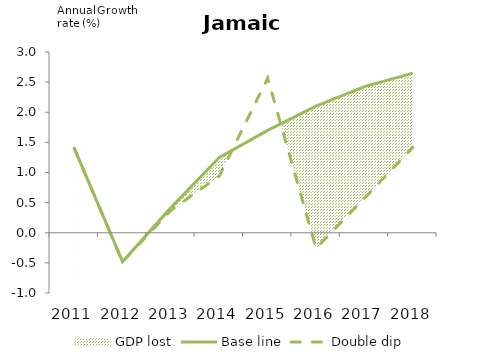
| Category | Double dip |
|---|---|
| 2011.0 | 1.405 |
| 2012.0 | -0.48 |
| 2013.0 | 0.372 |
| 2014.0 | 0.942 |
| 2015.0 | 2.567 |
| 2016.0 | -0.257 |
| 2017.0 | 0.573 |
| 2018.0 | 1.416 |